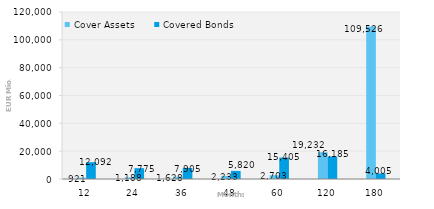
| Category | Cover Assets | Covered Bonds |
|---|---|---|
| 12.0 | 920.539 | 12092.407 |
| 24.0 | 1188.115 | 7775 |
| 36.0 | 1627.653 | 7905.128 |
| 48.0 | 2232.901 | 5820.202 |
| 60.0 | 2702.514 | 15405 |
| 120.0 | 19231.642 | 16185 |
| 180.0 | 109526.317 | 4005.499 |